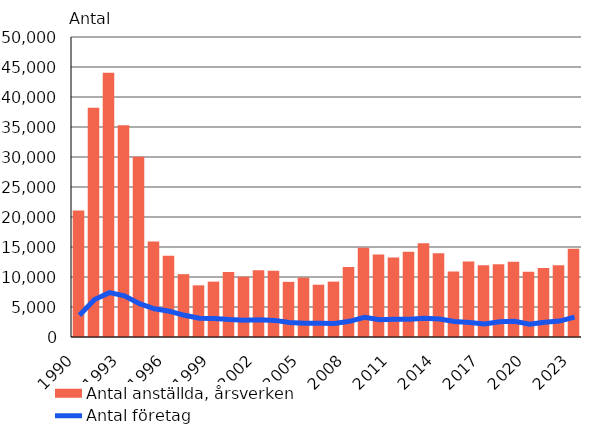
| Category | Antal anställda, årsverken |
|---|---|
| 1990.0 | 21101 |
| 1991.0 | 38200 |
| 1992.0 | 44050 |
| 1993.0 | 35282 |
| 1994.0 | 30052 |
| 1995.0 | 15922 |
| 1996.0 | 13551 |
| 1997.0 | 10473 |
| 1998.0 | 8612 |
| 1999.0 | 9226 |
| 2000.0 | 10849 |
| 2001.0 | 10047 |
| 2002.0 | 11126 |
| 2003.0 | 11061 |
| 2004.0 | 9191 |
| 2005.0 | 9898 |
| 2006.0 | 8717 |
| 2007.0 | 9230 |
| 2008.0 | 11660 |
| 2009.0 | 14860 |
| 2010.0 | 13759 |
| 2011.0 | 13270 |
| 2012.0 | 14206 |
| 2013.0 | 15637 |
| 2014.0 | 13951 |
| 2015.0 | 10902 |
| 2016.0 | 12580 |
| 2017.0 | 11943 |
| 2018.0 | 12127 |
| 2019.0 | 12548 |
| 2020.0 | 10876 |
| 2021.0 | 11490 |
| 2022.0 | 11973 |
| 2023.0 | 14719 |